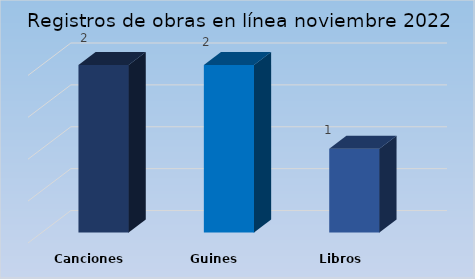
| Category | Series 0 |
|---|---|
| Canciones | 2 |
| Guines | 2 |
| Libros | 1 |